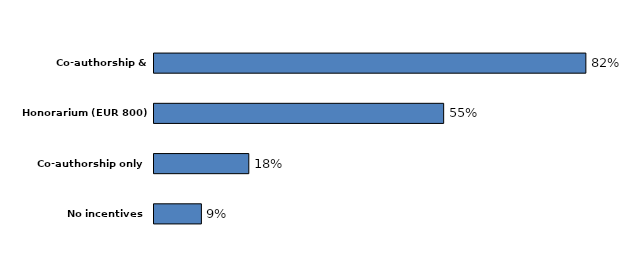
| Category | Final response rate |
|---|---|
| No incentives | 0.09 |
| Co-authorship only | 0.18 |
| Honorarium (EUR 800) only | 0.55 |
| Co-authorship & Honorarium | 0.82 |